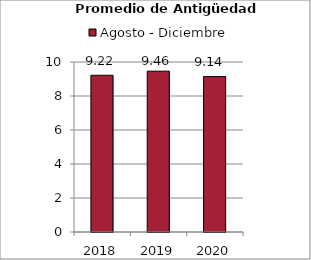
| Category | Agosto - Diciembre |
|---|---|
| 2018.0 | 9.22 |
| 2019.0 | 9.46 |
| 2020.0 | 9.14 |